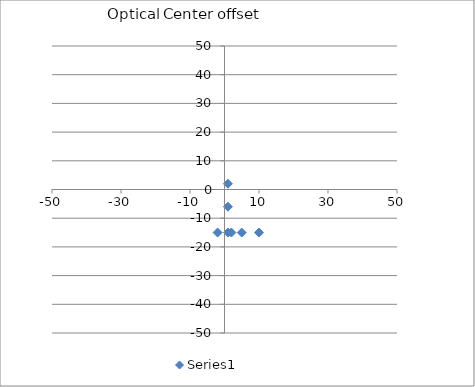
| Category | Series 0 |
|---|---|
| 10.0 | -15 |
| 5.0 | -15 |
| 2.0 | -15 |
| -2.0 | -15 |
| 1.0 | -15 |
| 1.0 | -6 |
| 1.0 | 2 |